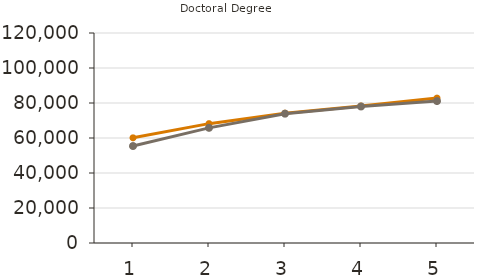
| Category | Mean | Median |
|---|---|---|
| 1.0 | 60100 | 55400 |
| 2.0 | 68200 | 65800 |
| 3.0 | 74200 | 73900 |
| 4.0 | 78300 | 78000 |
| 5.0 | 82800 | 81100 |